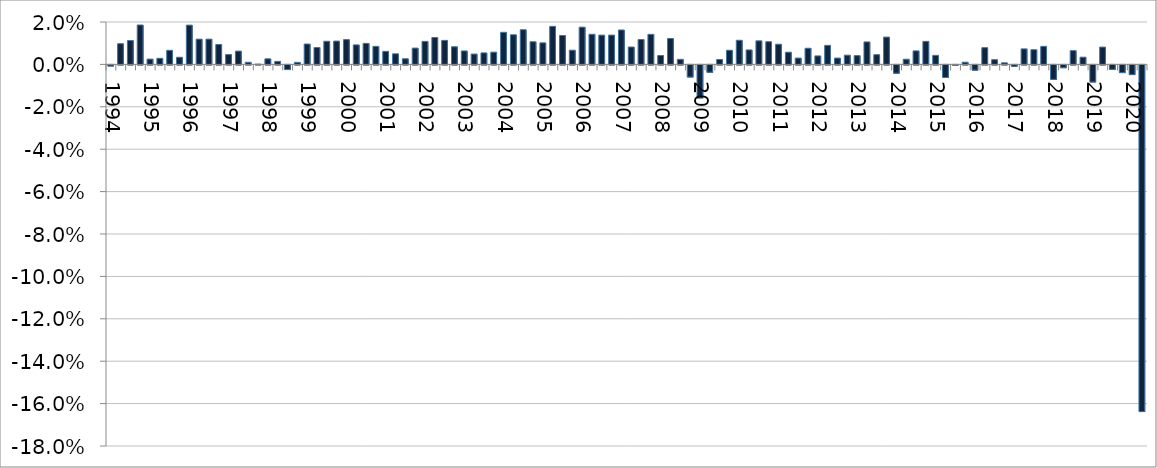
| Category | Actual quarterly change |
|---|---|
| 1994.0 | -0.001 |
| nan | 0.01 |
| nan | 0.011 |
| nan | 0.019 |
| 1995.0 | 0.002 |
| nan | 0.003 |
| nan | 0.007 |
| nan | 0.003 |
| 1996.0 | 0.019 |
| nan | 0.012 |
| nan | 0.012 |
| nan | 0.009 |
| 1997.0 | 0.005 |
| nan | 0.006 |
| nan | 0.001 |
| nan | 0 |
| 1998.0 | 0.003 |
| nan | 0.001 |
| nan | -0.002 |
| nan | 0.001 |
| 1999.0 | 0.01 |
| nan | 0.008 |
| nan | 0.011 |
| nan | 0.011 |
| 2000.0 | 0.012 |
| nan | 0.009 |
| nan | 0.01 |
| nan | 0.009 |
| 2001.0 | 0.006 |
| nan | 0.005 |
| nan | 0.003 |
| nan | 0.008 |
| 2002.0 | 0.011 |
| nan | 0.013 |
| nan | 0.011 |
| nan | 0.008 |
| 2003.0 | 0.006 |
| nan | 0.005 |
| nan | 0.005 |
| nan | 0.006 |
| 2004.0 | 0.015 |
| nan | 0.014 |
| nan | 0.016 |
| nan | 0.011 |
| 2005.0 | 0.01 |
| nan | 0.018 |
| nan | 0.014 |
| nan | 0.007 |
| 2006.0 | 0.018 |
| nan | 0.014 |
| nan | 0.014 |
| nan | 0.014 |
| 2007.0 | 0.016 |
| nan | 0.008 |
| nan | 0.012 |
| nan | 0.014 |
| 2008.0 | 0.004 |
| nan | 0.012 |
| nan | 0.002 |
| nan | -0.006 |
| 2009.0 | -0.016 |
| nan | -0.003 |
| nan | 0.002 |
| nan | 0.007 |
| 2010.0 | 0.011 |
| nan | 0.007 |
| nan | 0.011 |
| nan | 0.011 |
| 2011.0 | 0.01 |
| nan | 0.006 |
| nan | 0.003 |
| nan | 0.008 |
| 2012.0 | 0.004 |
| nan | 0.009 |
| nan | 0.003 |
| nan | 0.004 |
| 2013.0 | 0.004 |
| nan | 0.011 |
| nan | 0.005 |
| nan | 0.013 |
| 2014.0 | -0.004 |
| nan | 0.002 |
| nan | 0.006 |
| nan | 0.011 |
| 2015.0 | 0.004 |
| nan | -0.006 |
| nan | 0 |
| nan | 0.001 |
| 2016.0 | -0.002 |
| nan | 0.008 |
| nan | 0.002 |
| nan | 0.001 |
| 2017.0 | -0.001 |
| nan | 0.007 |
| nan | 0.007 |
| nan | 0.009 |
| 2018.0 | -0.007 |
| nan | -0.001 |
| nan | 0.006 |
| nan | 0.003 |
| 2019.0 | -0.008 |
| nan | 0.008 |
| nan | -0.002 |
| nan | -0.004 |
| 2020.0 | -0.005 |
| nan | -0.164 |